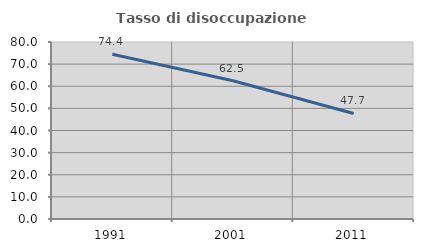
| Category | Tasso di disoccupazione giovanile  |
|---|---|
| 1991.0 | 74.447 |
| 2001.0 | 62.5 |
| 2011.0 | 47.706 |